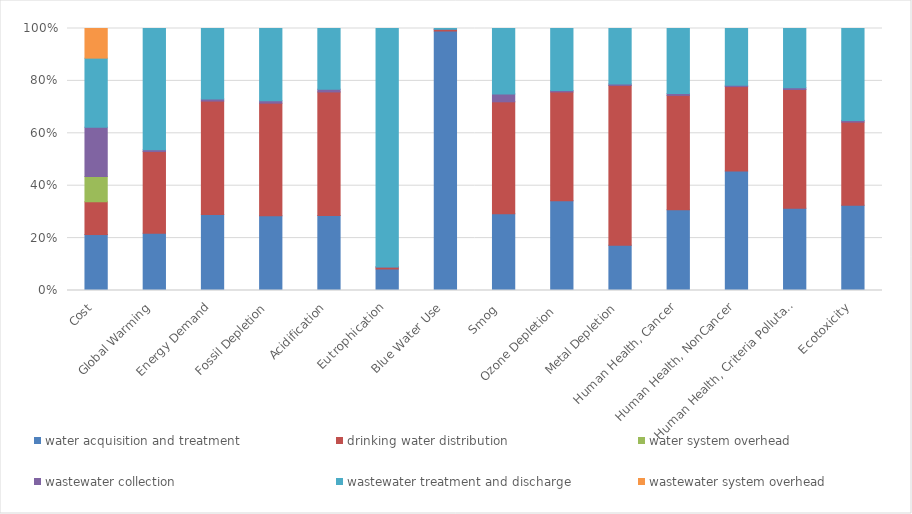
| Category | water acquisition and treatment | drinking water distribution | water system overhead | wastewater collection | wastewater treatment and discharge | wastewater system overhead |
|---|---|---|---|---|---|---|
| Cost | 0.214 | 0.125 | 0.096 | 0.188 | 0.264 | 0.113 |
| Global Warming | 0.219 | 0.312 | 0 | 0.007 | 0.463 | 0 |
| Energy Demand | 0.29 | 0.433 | 0 | 0.008 | 0.269 | 0 |
| Fossil Depletion | 0.286 | 0.429 | 0 | 0.009 | 0.276 | 0 |
| Acidification | 0.286 | 0.471 | 0 | 0.01 | 0.232 | 0 |
| Eutrophication | 0.082 | 0.007 | 0 | 0 | 0.91 | 0 |
| Blue Water Use | 0.99 | 0.007 | 0 | 0 | 0.003 | 0 |
| Smog  | 0.293 | 0.427 | 0 | 0.03 | 0.25 | 0 |
| Ozone Depletion  | 0.343 | 0.415 | 0 | 0.005 | 0.237 | 0 |
| Metal Depletion | 0.172 | 0.61 | 0 | 0.006 | 0.212 | 0 |
| Human Health, Cancer | 0.309 | 0.436 | 0 | 0.007 | 0.248 | 0 |
| Human Health, NonCancer | 0.456 | 0.322 | 0 | 0.005 | 0.217 | 0 |
| Human Health, Criteria Pollutants | 0.314 | 0.453 | 0 | 0.007 | 0.226 | 0 |
| Ecotoxicity | 0.326 | 0.317 | 0 | 0.006 | 0.351 | 0 |